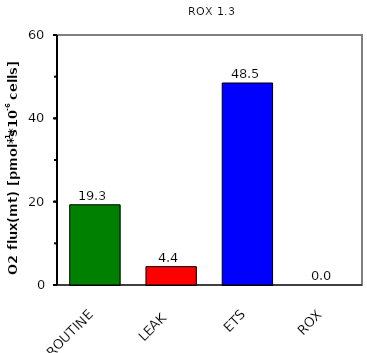
| Category | ROX 1,3 |
|---|---|
| ROUTINE | 19.26 |
| LEAK | 4.408 |
| ETS | 48.482 |
| ROX | 0 |